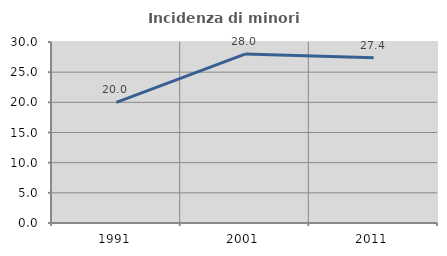
| Category | Incidenza di minori stranieri |
|---|---|
| 1991.0 | 20 |
| 2001.0 | 28 |
| 2011.0 | 27.389 |